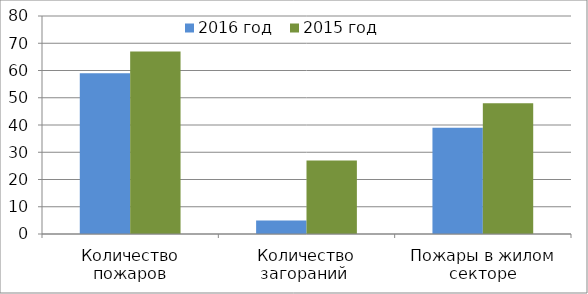
| Category | 2016 год | 2015 год |
|---|---|---|
| Количество пожаров | 59 | 67 |
| Количество загораний  | 5 | 27 |
| Пожары в жилом секторе | 39 | 48 |